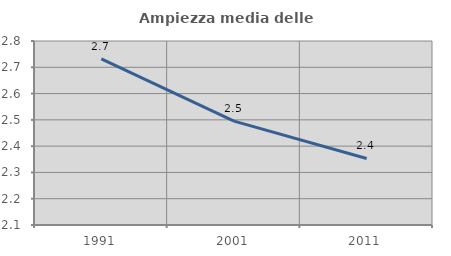
| Category | Ampiezza media delle famiglie |
|---|---|
| 1991.0 | 2.732 |
| 2001.0 | 2.495 |
| 2011.0 | 2.353 |